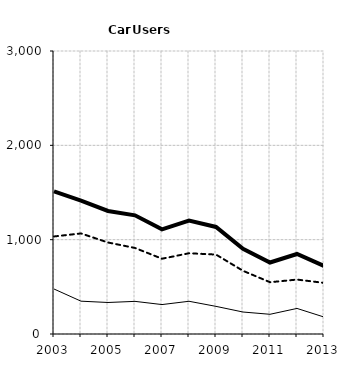
| Category | Built-up | Non built-up | Total |
|---|---|---|---|
| 2003.0 | 477 | 1034 | 1511 |
| 2004.0 | 348 | 1066 | 1414 |
| 2005.0 | 334 | 970 | 1304 |
| 2006.0 | 346 | 912 | 1258 |
| 2007.0 | 312 | 798 | 1110 |
| 2008.0 | 347 | 856 | 1203 |
| 2009.0 | 293 | 842 | 1135 |
| 2010.0 | 233 | 670 | 903 |
| 2011.0 | 209 | 549 | 758 |
| 2012.0 | 271 | 577 | 848 |
| 2013.0 | 180 | 542 | 722 |